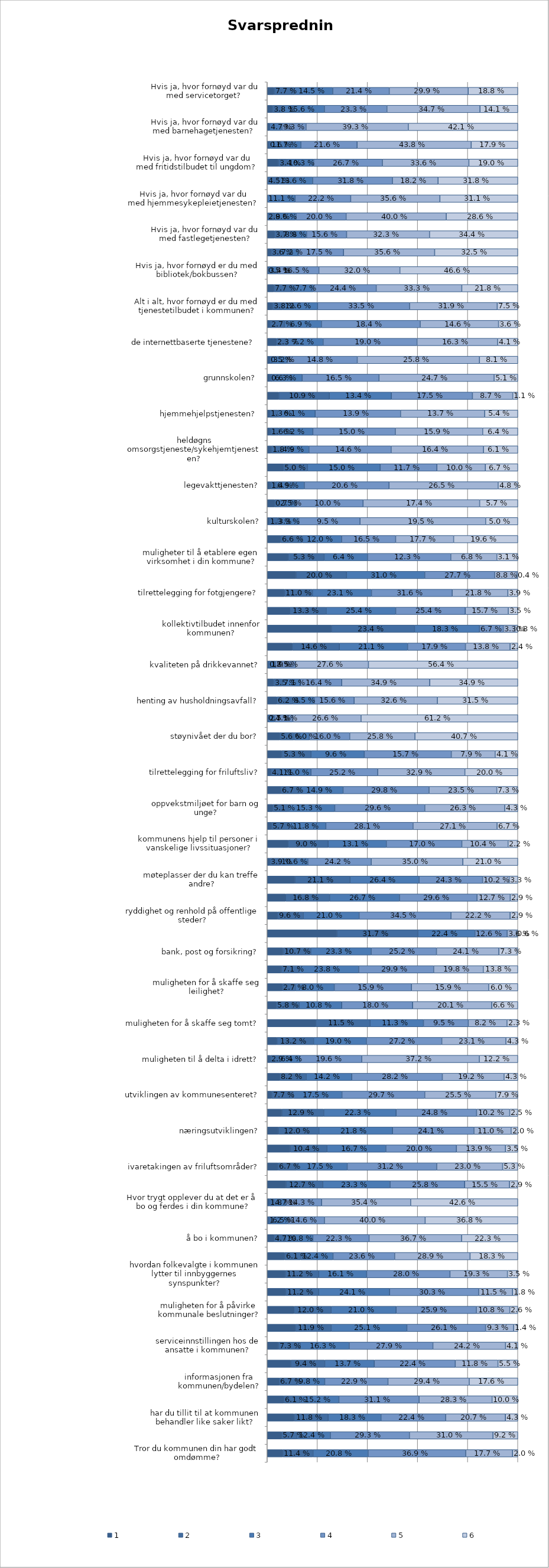
| Category | 1 | 2 | 3 | 4 | 5 | 6 |
|---|---|---|---|---|---|---|
| Hvis ja, hvor fornøyd var du med servicetorget?  | 0.026 | 0.077 | 0.145 | 0.214 | 0.299 | 0.188 |
| Hvis ja, hvor fornøyd var du med de internettbaserte tjenestene?  | 0.019 | 0.038 | 0.156 | 0.233 | 0.347 | 0.141 |
| Hvis ja, hvor fornøyd var du med barnehagetjenesten?  | 0.009 | 0 | 0.047 | 0.093 | 0.393 | 0.421 |
| Hvis ja, hvor fornøyd var du med grunnskolen?  | 0.006 | 0.006 | 0.117 | 0.216 | 0.438 | 0.179 |
| Hvis ja, hvor fornøyd var du med fritidstilbudet til ungdom?  | 0.043 | 0.034 | 0.103 | 0.267 | 0.336 | 0.19 |
| Hvis ja, hvor fornøyd var du med hjemmehjelpstjenesten?  | 0 | 0.045 | 0.136 | 0.318 | 0.182 | 0.318 |
| Hvis ja, hvor fornøyd var du med hjemmesykepleietjenesten?  | 0 | 0 | 0.111 | 0.222 | 0.356 | 0.311 |
| Hvis ja, hvor fornøyd var du med heldøgns omsorgstjeneste/sykehjemtjenesten? | 0 | 0.029 | 0.086 | 0.2 | 0.4 | 0.286 |
| Hvis ja, hvor fornøyd var du med fastlegetjenesten? | 0.028 | 0.037 | 0.088 | 0.156 | 0.323 | 0.344 |
| Hvis ja, hvor fornøyd var du med legevakttjenesten? | 0.015 | 0.036 | 0.072 | 0.175 | 0.356 | 0.325 |
| Hvis ja, hvor fornøyd er du med bibliotek/bokbussen? | 0 | 0.005 | 0.034 | 0.165 | 0.32 | 0.466 |
| Hvis ja, hvor fornøyd var du med kulturskolen? | 0.026 | 0.077 | 0.077 | 0.244 | 0.333 | 0.218 |
| Alt i alt, hvor fornøyd er du med tjenestetilbudet i kommunen? | 0.019 | 0.038 | 0.126 | 0.335 | 0.319 | 0.075 |
|  servicetorget?  | 0.005 | 0.027 | 0.069 | 0.184 | 0.146 | 0.036 |
| de internettbaserte tjenestene?  | 0.018 | 0.023 | 0.072 | 0.19 | 0.163 | 0.041 |
| barnehagetjenesten?  | 0.005 | 0.005 | 0.032 | 0.148 | 0.258 | 0.081 |
|  grunnskolen?  | 0.006 | 0.006 | 0.063 | 0.165 | 0.247 | 0.051 |
|  fritidstilbudet til ungdom?  | 0.025 | 0.109 | 0.134 | 0.175 | 0.087 | 0.011 |
|  hjemmehjelpstjenesten?  | 0.004 | 0.013 | 0.061 | 0.139 | 0.137 | 0.054 |
|  hjemmesykepleietjenesten? | 0.005 | 0.016 | 0.062 | 0.15 | 0.159 | 0.064 |
|  heldøgns omsorgstjeneste/sykehjemtjenesten? | 0.007 | 0.018 | 0.049 | 0.146 | 0.164 | 0.061 |
|  fastlegetjenesten? | 0.033 | 0.05 | 0.15 | 0.117 | 0.1 | 0.067 |
|  legevakttjenesten? | 0.007 | 0.014 | 0.069 | 0.206 | 0.265 | 0.048 |
| bibliotek/bokbussen? | 0.011 | 0.007 | 0.025 | 0.1 | 0.174 | 0.057 |
| kulturskolen? | 0.003 | 0.013 | 0.033 | 0.095 | 0.195 | 0.05 |
| muligheter til å få arbeid innen rimelig avstand fra hjemmet? | 0.041 | 0.066 | 0.12 | 0.165 | 0.177 | 0.196 |
| muligheter til å etablere egen virksomhet i din kommune? | 0.031 | 0.053 | 0.064 | 0.123 | 0.068 | 0.031 |
| standard på veier og gater? | 0.114 | 0.2 | 0.31 | 0.277 | 0.088 | 0.004 |
| tilrettelegging for fotgjengere? | 0.067 | 0.11 | 0.231 | 0.316 | 0.218 | 0.039 |
| tilrettelegging for syklister? | 0.082 | 0.133 | 0.254 | 0.254 | 0.157 | 0.035 |
| kollektivtilbudet innenfor kommunen? | 0.181 | 0.234 | 0.183 | 0.067 | 0.033 | 0.008 |
| kollektivtilbudet inn og ut av kommunen? | 0.077 | 0.146 | 0.211 | 0.179 | 0.138 | 0.024 |
| kvaliteten på drikkevannet? | 0.004 | 0.008 | 0.019 | 0.075 | 0.276 | 0.564 |
| muligheten for sortering av avfall for gjenvinning? | 0.025 | 0.035 | 0.071 | 0.164 | 0.349 | 0.349 |
| henting av husholdningsavfall? | 0.037 | 0.062 | 0.085 | 0.156 | 0.326 | 0.315 |
| luftkvaliteten? | 0 | 0.004 | 0.025 | 0.071 | 0.266 | 0.612 |
| støynivået der du bor? | 0.05 | 0.056 | 0.06 | 0.16 | 0.258 | 0.407 |
| kommunens innsats for å møte klimautfordringene? | 0.026 | 0.053 | 0.096 | 0.157 | 0.079 | 0.041 |
| tilrettelegging for friluftsliv? | 0.014 | 0.041 | 0.11 | 0.252 | 0.329 | 0.2 |
| hvordan kommunen tar vare på naturen og landskapet? | 0.047 | 0.067 | 0.149 | 0.298 | 0.235 | 0.073 |
| oppvekstmiljøet for barn og unge? | 0.018 | 0.051 | 0.153 | 0.296 | 0.263 | 0.043 |
| kommunen som bosted for eldre? | 0.014 | 0.057 | 0.118 | 0.281 | 0.271 | 0.067 |
| kommunens hjelp til personer i vanskelige livssituasjoner? | 0.047 | 0.09 | 0.131 | 0.17 | 0.104 | 0.022 |
| naboskap og sosialt fellesskap? | 0.01 | 0.039 | 0.106 | 0.242 | 0.35 | 0.21 |
| møteplasser der du kan treffe andre? | 0.106 | 0.211 | 0.264 | 0.243 | 0.102 | 0.033 |
| folkeliv og aktivitet i kommunen? | 0.07 | 0.168 | 0.267 | 0.296 | 0.127 | 0.029 |
| ryddighet og renhold på offentlige steder? | 0.039 | 0.096 | 0.21 | 0.345 | 0.222 | 0.029 |
| tilbudet av kafeer, restauranter, uteliv? | 0.273 | 0.317 | 0.224 | 0.126 | 0.036 | 0.006 |
| bank, post og forsikring? | 0.061 | 0.107 | 0.233 | 0.252 | 0.241 | 0.073 |
| butikktilbudet? | 0.056 | 0.071 | 0.238 | 0.299 | 0.198 | 0.138 |
| muligheten for å skaffe seg leilighet? | 0.031 | 0.027 | 0.08 | 0.159 | 0.159 | 0.06 |
| muligheten for å skaffe seg enebolig/rekkehus? | 0.023 | 0.058 | 0.108 | 0.18 | 0.201 | 0.066 |
| muligheten for å skaffe seg tomt? | 0.103 | 0.115 | 0.113 | 0.095 | 0.082 | 0.023 |
| kulturtilbudet i kommunen? | 0.035 | 0.132 | 0.19 | 0.272 | 0.231 | 0.043 |
| muligheten til å delta i idrett? | 0.01 | 0.029 | 0.064 | 0.196 | 0.372 | 0.122 |
| andre fritidsaktiviteter? | 0.039 | 0.082 | 0.142 | 0.282 | 0.192 | 0.043 |
| utviklingen av kommunesenteret? | 0.016 | 0.077 | 0.175 | 0.297 | 0.255 | 0.079 |
| utviklingen av andre tettsteder/boområder i kommunen? | 0.045 | 0.129 | 0.223 | 0.248 | 0.102 | 0.025 |
| næringsutviklingen? | 0.033 | 0.12 | 0.218 | 0.241 | 0.11 | 0.02 |
| bevaringen av dyrket mark? | 0.065 | 0.104 | 0.167 | 0.2 | 0.139 | 0.035 |
| ivaretakingen av friluftsområder? | 0.037 | 0.067 | 0.175 | 0.312 | 0.23 | 0.053 |
| leke- og aktivitetsområder? | 0.065 | 0.127 | 0.233 | 0.258 | 0.155 | 0.029 |
| Hvor trygt opplever du at det er å bo og ferdes i din kommune? | 0.008 | 0.018 | 0.047 | 0.143 | 0.354 | 0.426 |
| området der du bor? | 0.004 | 0.012 | 0.065 | 0.146 | 0.4 | 0.368 |
| å bo i kommunen? | 0.026 | 0.047 | 0.108 | 0.223 | 0.367 | 0.223 |
| I hvilken grad vil du anbefale dine venner og bekjente å flytte til din kommune? | 0.067 | 0.061 | 0.124 | 0.236 | 0.289 | 0.183 |
| hvordan folkevalgte i kommunen lytter til innbyggernes synspunkter? | 0.061 | 0.112 | 0.161 | 0.28 | 0.193 | 0.035 |
| hvordan folkevalgte i kommunen løser lokale utfordringer? | 0.063 | 0.112 | 0.241 | 0.303 | 0.115 | 0.018 |
| muligheten for å påvirke kommunale beslutninger? | 0.086 | 0.12 | 0.21 | 0.259 | 0.108 | 0.026 |
| hvordan kommunen følger opp det som er blitt lovet? | 0.093 | 0.119 | 0.251 | 0.261 | 0.093 | 0.014 |
| serviceinnstillingen hos de ansatte i kommunen? | 0.037 | 0.073 | 0.163 | 0.279 | 0.242 | 0.041 |
| hvor raskt du får hjelp/svar på dine spørsmål? | 0.065 | 0.094 | 0.137 | 0.224 | 0.118 | 0.055 |
| informasjonen fra kommunen/bydelen? | 0.043 | 0.067 | 0.098 | 0.229 | 0.294 | 0.176 |
| har du tillit til at politikerne i kommunen arbeider for befolkningens beste? | 0.065 | 0.061 | 0.152 | 0.311 | 0.283 | 0.1 |
| har du tillit til at kommunen behandler like saker likt? | 0.093 | 0.118 | 0.183 | 0.224 | 0.207 | 0.043 |
| har du tillit til at kommunen følger lover og regler? | 0.053 | 0.057 | 0.124 | 0.293 | 0.31 | 0.092 |
| Tror du kommunen din har godt omdømme? | 0.059 | 0.114 | 0.208 | 0.369 | 0.177 | 0.02 |